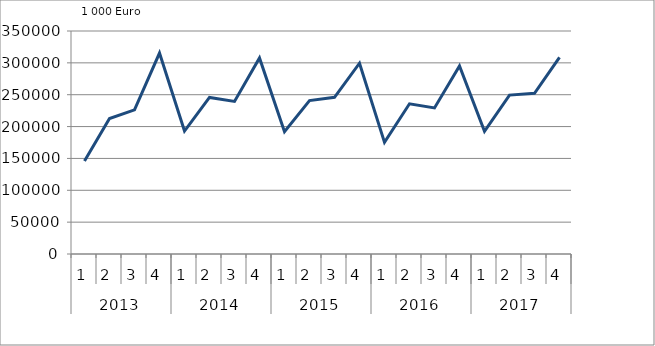
| Category | Ausbaugewerblicher Umsatz3 |
|---|---|
| 0 | 145792.596 |
| 1 | 212577 |
| 2 | 226327.748 |
| 3 | 315433.896 |
| 4 | 193004.858 |
| 5 | 245754.159 |
| 6 | 239547.85 |
| 7 | 307688.935 |
| 8 | 192043.756 |
| 9 | 240826.879 |
| 10 | 245916.087 |
| 11 | 299455.378 |
| 12 | 175225.59 |
| 13 | 235781.631 |
| 14 | 229227.559 |
| 15 | 294992.157 |
| 16 | 192499.539 |
| 17 | 249394.388 |
| 18 | 252146.755 |
| 19 | 308653.153 |